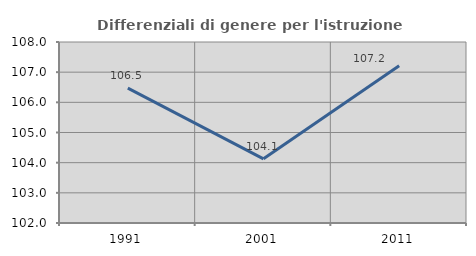
| Category | Differenziali di genere per l'istruzione superiore |
|---|---|
| 1991.0 | 106.471 |
| 2001.0 | 104.128 |
| 2011.0 | 107.21 |